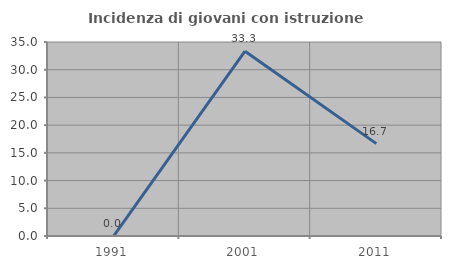
| Category | Incidenza di giovani con istruzione universitaria |
|---|---|
| 1991.0 | 0 |
| 2001.0 | 33.333 |
| 2011.0 | 16.667 |